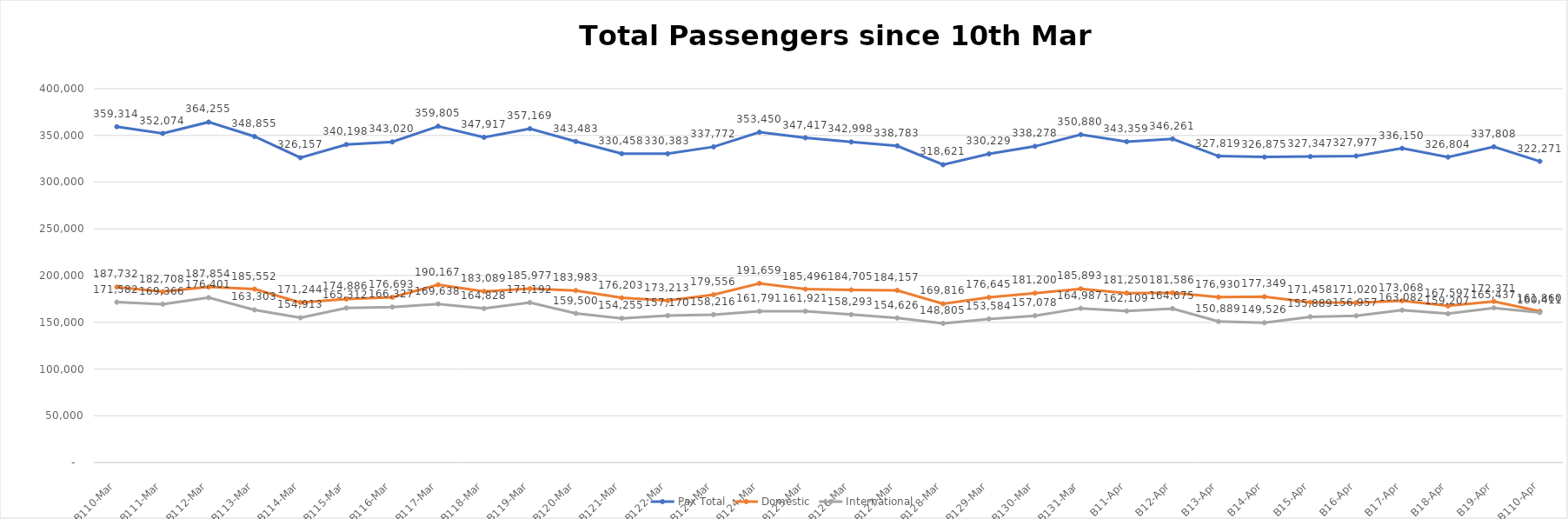
| Category | Pax Total |  Domestic  |  International  |
|---|---|---|---|
| 2023-03-10 | 359314 | 187732 | 171582 |
| 2023-03-11 | 352074 | 182708 | 169366 |
| 2023-03-12 | 364255 | 187854 | 176401 |
| 2023-03-13 | 348855 | 185552 | 163303 |
| 2023-03-14 | 326157 | 171244 | 154913 |
| 2023-03-15 | 340198 | 174886 | 165312 |
| 2023-03-16 | 343020 | 176693 | 166327 |
| 2023-03-17 | 359805 | 190167 | 169638 |
| 2023-03-18 | 347917 | 183089 | 164828 |
| 2023-03-19 | 357169 | 185977 | 171192 |
| 2023-03-20 | 343483 | 183983 | 159500 |
| 2023-03-21 | 330458 | 176203 | 154255 |
| 2023-03-22 | 330383 | 173213 | 157170 |
| 2023-03-23 | 337772 | 179556 | 158216 |
| 2023-03-24 | 353450 | 191659 | 161791 |
| 2023-03-25 | 347417 | 185496 | 161921 |
| 2023-03-26 | 342998 | 184705 | 158293 |
| 2023-03-27 | 338783 | 184157 | 154626 |
| 2023-03-28 | 318621 | 169816 | 148805 |
| 2023-03-29 | 330229 | 176645 | 153584 |
| 2023-03-30 | 338278 | 181200 | 157078 |
| 2023-03-31 | 350880 | 185893 | 164987 |
| 2023-04-01 | 343359 | 181250 | 162109 |
| 2023-04-02 | 346261 | 181586 | 164675 |
| 2023-04-03 | 327819 | 176930 | 150889 |
| 2023-04-04 | 326875 | 177349 | 149526 |
| 2023-04-05 | 327347 | 171458 | 155889 |
| 2023-04-06 | 327977 | 171020 | 156957 |
| 2023-04-07 | 336150 | 173068 | 163082 |
| 2023-04-08 | 326804 | 167597 | 159207 |
| 2023-04-09 | 337808 | 172371 | 165437 |
| 2023-04-10 | 322271 | 161860 | 160411 |